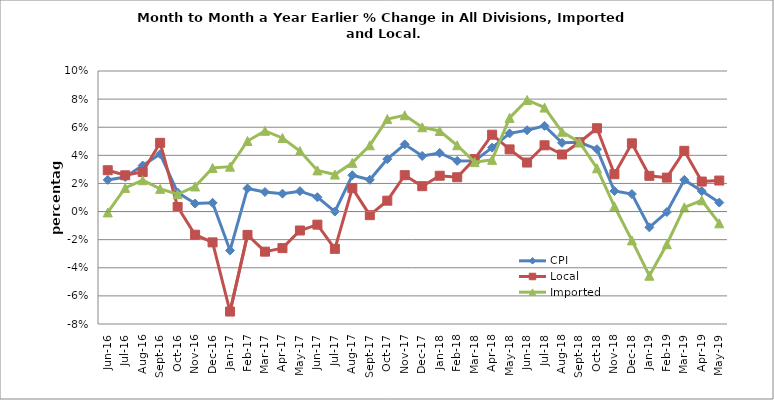
| Category | CPI | Local | Imported |
|---|---|---|---|
| 2016-06-01 | 0.023 | 0.029 | -0.001 |
| 2016-07-01 | 0.025 | 0.026 | 0.017 |
| 2016-08-01 | 0.033 | 0.028 | 0.022 |
| 2016-09-01 | 0.041 | 0.049 | 0.016 |
| 2016-10-01 | 0.014 | 0.003 | 0.012 |
| 2016-11-01 | 0.006 | -0.016 | 0.018 |
| 2016-12-01 | 0.006 | -0.022 | 0.031 |
| 2017-01-01 | -0.028 | -0.071 | 0.032 |
| 2017-02-01 | 0.016 | -0.017 | 0.05 |
| 2017-03-01 | 0.014 | -0.029 | 0.057 |
| 2017-04-01 | 0.013 | -0.026 | 0.052 |
| 2017-05-01 | 0.015 | -0.013 | 0.043 |
| 2017-06-01 | 0.01 | -0.009 | 0.029 |
| 2017-07-01 | 0 | -0.027 | 0.026 |
| 2017-08-01 | 0.026 | 0.017 | 0.035 |
| 2017-09-01 | 0.023 | -0.003 | 0.047 |
| 2017-10-01 | 0.037 | 0.008 | 0.066 |
| 2017-11-01 | 0.048 | 0.026 | 0.069 |
| 2017-12-01 | 0.04 | 0.018 | 0.06 |
| 2018-01-01 | 0.042 | 0.025 | 0.057 |
| 2018-02-01 | 0.036 | 0.024 | 0.047 |
| 2018-03-01 | 0.036 | 0.037 | 0.035 |
| 2018-04-01 | 0.045 | 0.055 | 0.037 |
| 2018-05-01 | 0.056 | 0.044 | 0.067 |
| 2018-06-01 | 0.058 | 0.035 | 0.079 |
| 2018-07-01 | 0.061 | 0.047 | 0.074 |
| 2018-08-01 | 0.049 | 0.041 | 0.057 |
| 2018-09-01 | 0.049 | 0.049 | 0.049 |
| 2018-10-01 | 0.044 | 0.059 | 0.031 |
| 2018-11-01 | 0.015 | 0.027 | 0.004 |
| 2018-12-01 | 0.012 | 0.049 | -0.021 |
| 2019-01-01 | -0.011 | 0.025 | -0.046 |
| 2019-02-01 | 0 | 0.024 | -0.023 |
| 2019-03-01 | 0.023 | 0.043 | 0.003 |
| 2019-04-01 | 0.015 | 0.021 | 0.008 |
| 2019-05-01 | 0.006 | 0.022 | -0.008 |